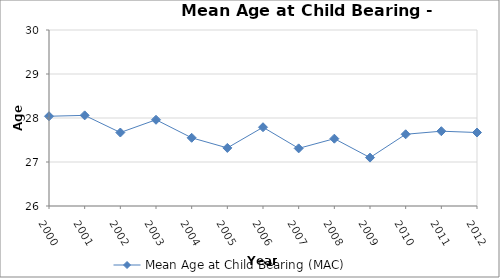
| Category | Mean Age at Child Bearing (MAC) |
|---|---|
| 2000.0 | 28.04 |
| 2001.0 | 28.06 |
| 2002.0 | 27.67 |
| 2003.0 | 27.96 |
| 2004.0 | 27.55 |
| 2005.0 | 27.32 |
| 2006.0 | 27.79 |
| 2007.0 | 27.31 |
| 2008.0 | 27.53 |
| 2009.0 | 27.1 |
| 2010.0 | 27.63 |
| 2011.0 | 27.7 |
| 2012.0 | 27.67 |